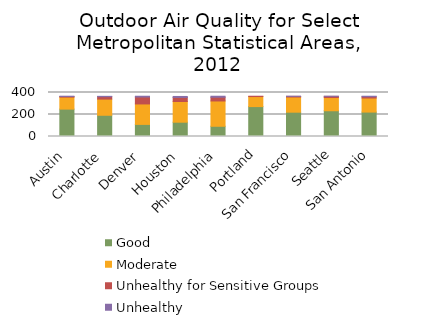
| Category | Good | Moderate | Unhealthy for Sensitive Groups | Unhealthy   |
|---|---|---|---|---|
| Austin | 249 | 109 | 6 | 2 |
| Charlotte | 193 | 147 | 22 | 3 |
| Denver | 110 | 186 | 63 | 7 |
| Houston | 130 | 188 | 37 | 9 |
| Philadelphia | 93 | 230 | 34 | 9 |
| Portland | 272 | 91 | 3 | 0 |
| San Francisco | 221 | 138 | 6 | 1 |
| Seattle | 234 | 120 | 11 | 1 |
| San Antonio | 222 | 128 | 12 | 4 |